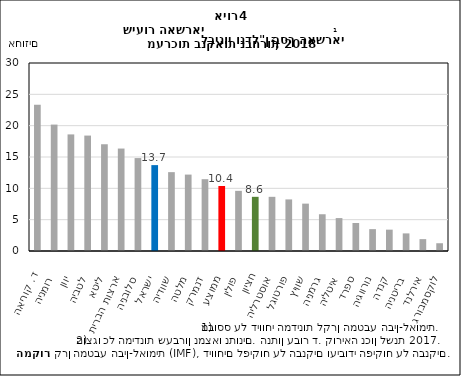
| Category | commercial real share |
|---|---|
| ד. קוריאה | 23.349 |
| רומניה | 20.173 |
| יוון | 18.605 |
| לטביה | 18.42 |
| ליטא | 17.034 |
| ארצות הברית | 16.349 |
| סלובניה | 14.827 |
| ישראל | 13.705 |
| שוודיה | 12.582 |
| מלטה | 12.194 |
| דנמרק | 11.459 |
| ממוצע | 10.374 |
| פולין | 9.599 |
| חציון | 8.645 |
| אוסטרליה | 8.645 |
| פורטוגל | 8.232 |
| שוויץ | 7.559 |
| גרמניה | 5.864 |
| איטליה | 5.253 |
| ספרד | 4.469 |
| נורווגיה | 3.489 |
| קנדה | 3.406 |
| בריטניה | 2.809 |
| אירלנד | 1.894 |
| לוקסמבורג | 1.239 |